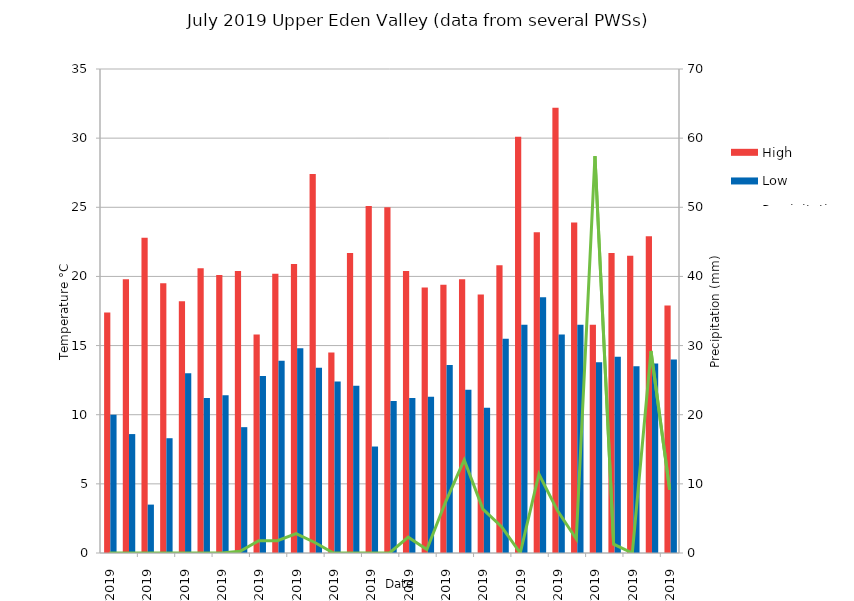
| Category | High | Low |
|---|---|---|
| 01/07/2019 | 17.4 | 10 |
| 02/07/2019 | 19.8 | 8.6 |
| 03/07/2019 | 22.8 | 3.5 |
| 04/07/2019 | 19.5 | 8.3 |
| 05/07/2019 | 18.2 | 13 |
| 06/07/2019 | 20.6 | 11.2 |
| 07/07/2019 | 20.1 | 11.4 |
| 08/07/2019 | 20.4 | 9.1 |
| 09/07/2019 | 15.8 | 12.8 |
| 10/07/2019 | 20.2 | 13.9 |
| 11/07/2019 | 20.9 | 14.8 |
| 12/07/2019 | 27.4 | 13.4 |
| 13/07/2019 | 14.5 | 12.4 |
| 14/07/2019 | 21.7 | 12.1 |
| 15/07/2019 | 25.1 | 7.7 |
| 16/07/2019 | 25 | 11 |
| 17/07/2019 | 20.4 | 11.2 |
| 18/07/2019 | 19.2 | 11.3 |
| 19/07/2019 | 19.4 | 13.6 |
| 20/07/2019 | 19.8 | 11.8 |
| 21/07/2019 | 18.7 | 10.5 |
| 22/07/2019 | 20.8 | 15.5 |
| 23/07/2019 | 30.1 | 16.5 |
| 24/07/2019 | 23.2 | 18.5 |
| 25/07/2019 | 32.2 | 15.8 |
| 26/07/2019 | 23.9 | 16.5 |
| 27/07/2019 | 16.5 | 13.8 |
| 28/07/2019 | 21.7 | 14.2 |
| 29/07/2019 | 21.5 | 13.5 |
| 30/07/2019 | 22.9 | 13.7 |
| 31/07/2019 | 17.9 | 14 |